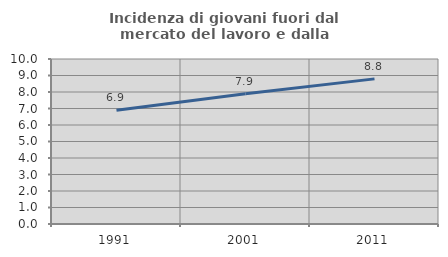
| Category | Incidenza di giovani fuori dal mercato del lavoro e dalla formazione  |
|---|---|
| 1991.0 | 6.891 |
| 2001.0 | 7.893 |
| 2011.0 | 8.795 |